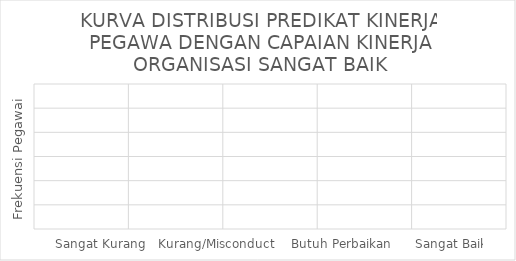
| Category | Series 0 |
|---|---|
| 0 | 3 |
| 1 | 4 |
| 2 | 10 |
| 3 | 4 |
| 4 | 3 |